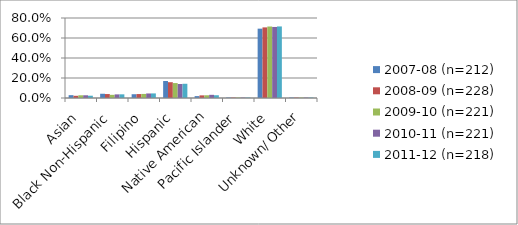
| Category | 2007-08 (n=212) | 2008-09 (n=228) | 2009-10 (n=221) | 2010-11 (n=221) | 2011-12 (n=218) |
|---|---|---|---|---|---|
| Asian | 0.028 | 0.022 | 0.027 | 0.027 | 0.023 |
| Black Non-Hispanic | 0.042 | 0.039 | 0.032 | 0.036 | 0.037 |
| Filipino | 0.038 | 0.039 | 0.041 | 0.045 | 0.046 |
| Hispanic | 0.17 | 0.158 | 0.149 | 0.14 | 0.142 |
| Native American | 0.019 | 0.026 | 0.027 | 0.032 | 0.028 |
| Pacific Islander | 0.005 | 0.004 | 0.005 | 0.005 | 0.005 |
| White | 0.693 | 0.706 | 0.715 | 0.71 | 0.716 |
| Unknown/ Other | 0.005 | 0.004 | 0.005 | 0.005 | 0.005 |